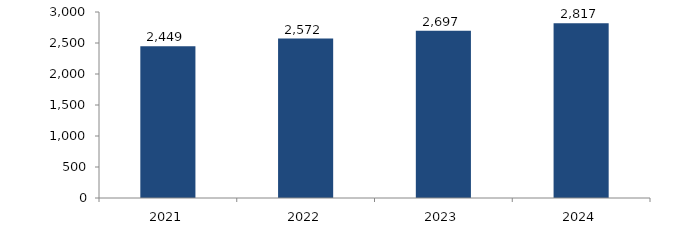
| Category | Bogotá |
|---|---|
| 2021.0 | 2448.653 |
| 2022.0 | 2572.241 |
| 2023.0 | 2697.176 |
| 2024.0 | 2816.931 |